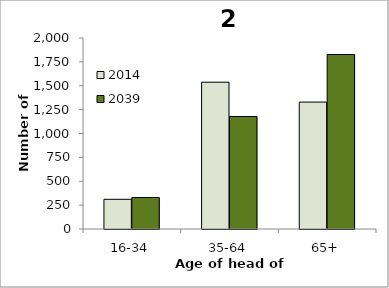
| Category | 2014 | 2039 |
|---|---|---|
| 16-34 | 311 | 330 |
| 35-64 | 1537 | 1178 |
| 65+ | 1329 | 1827 |